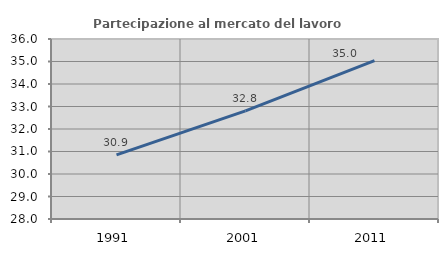
| Category | Partecipazione al mercato del lavoro  femminile |
|---|---|
| 1991.0 | 30.851 |
| 2001.0 | 32.809 |
| 2011.0 | 35.036 |